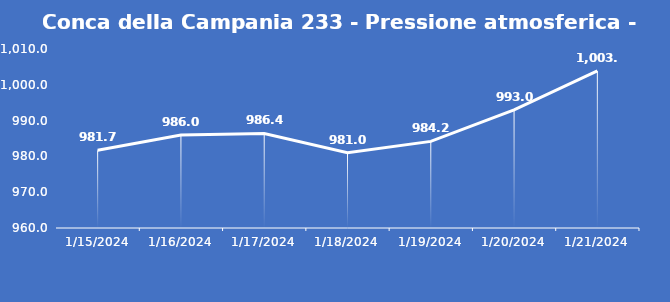
| Category | Conca della Campania 233 - Pressione atmosferica - Grezzo (hPa) |
|---|---|
| 1/15/24 | 981.7 |
| 1/16/24 | 986 |
| 1/17/24 | 986.4 |
| 1/18/24 | 981 |
| 1/19/24 | 984.2 |
| 1/20/24 | 993 |
| 1/21/24 | 1003.9 |